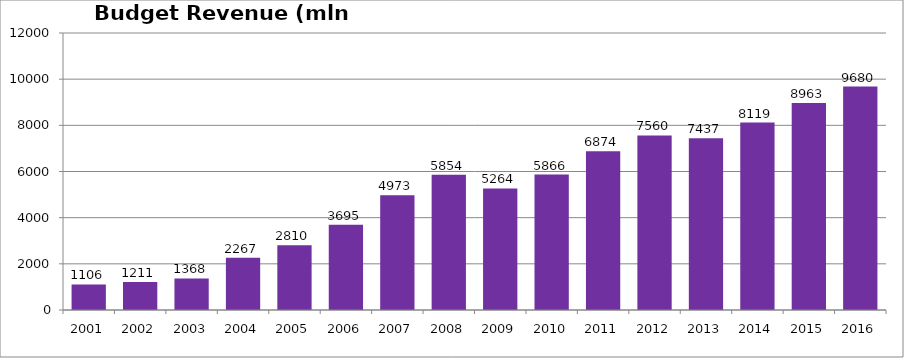
| Category | Budget Revenue (mln GEL) |
|---|---|
| 2001.0 | 1105.679 |
| 2002.0 | 1211.017 |
| 2003.0 | 1367.813 |
| 2004.0 | 2266.625 |
| 2005.0 | 2810.25 |
| 2006.0 | 3694.684 |
| 2007.0 | 4972.635 |
| 2008.0 | 5854.175 |
| 2009.0 | 5264.495 |
| 2010.0 | 5865.801 |
| 2011.0 | 6873.661 |
| 2012.0 | 7560.046 |
| 2013.0 | 7437.173 |
| 2014.0 | 8118.8 |
| 2015.0 | 8963.17 |
| 2016.0 | 9679.561 |